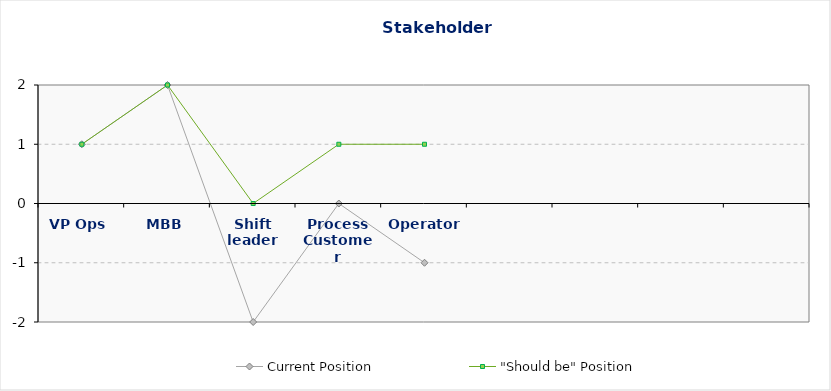
| Category | Current Position | "Should be" Position |
|---|---|---|
| VP Ops | 1 | 1 |
| MBB | 2 | 2 |
| Shift leader | -2 | 0 |
| Process Customer | 0 | 1 |
| Operator | -1 | 1 |